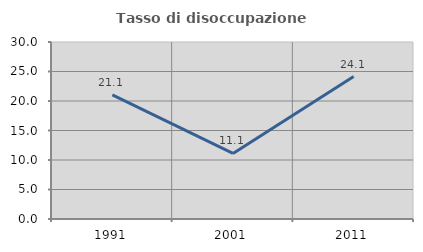
| Category | Tasso di disoccupazione giovanile  |
|---|---|
| 1991.0 | 21.053 |
| 2001.0 | 11.111 |
| 2011.0 | 24.138 |